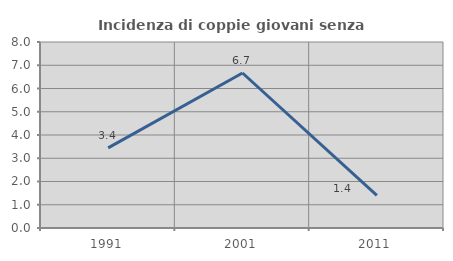
| Category | Incidenza di coppie giovani senza figli |
|---|---|
| 1991.0 | 3.448 |
| 2001.0 | 6.667 |
| 2011.0 | 1.399 |